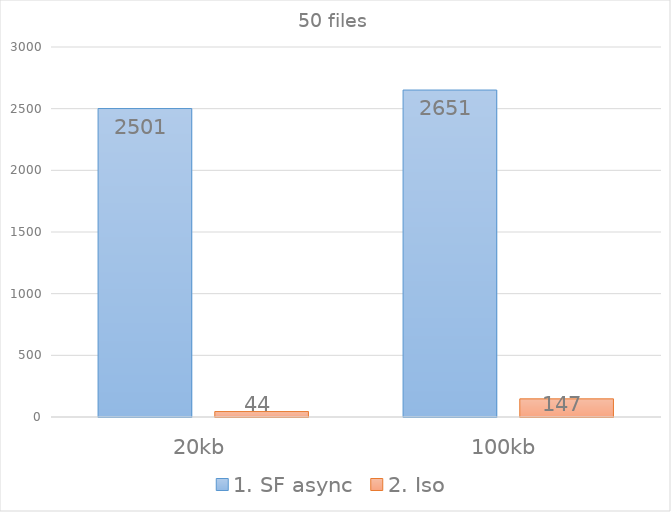
| Category | 1. SF async | 2. Iso |
|---|---|---|
| 20kb | 2501 | 44 |
| 100kb | 2651 | 147 |